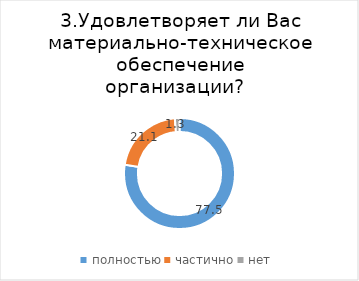
| Category | Series 0 |
|---|---|
| полностью | 77.543 |
| частично | 21.113 |
| нет | 1.344 |